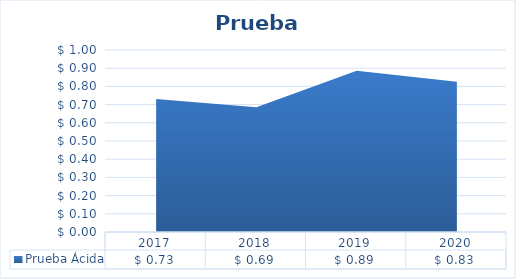
| Category | Prueba Ácida |
|---|---|
| 2017.0 | 0.731 |
| 2018.0 | 0.686 |
| 2019.0 | 0.886 |
| 2020.0 | 0.826 |